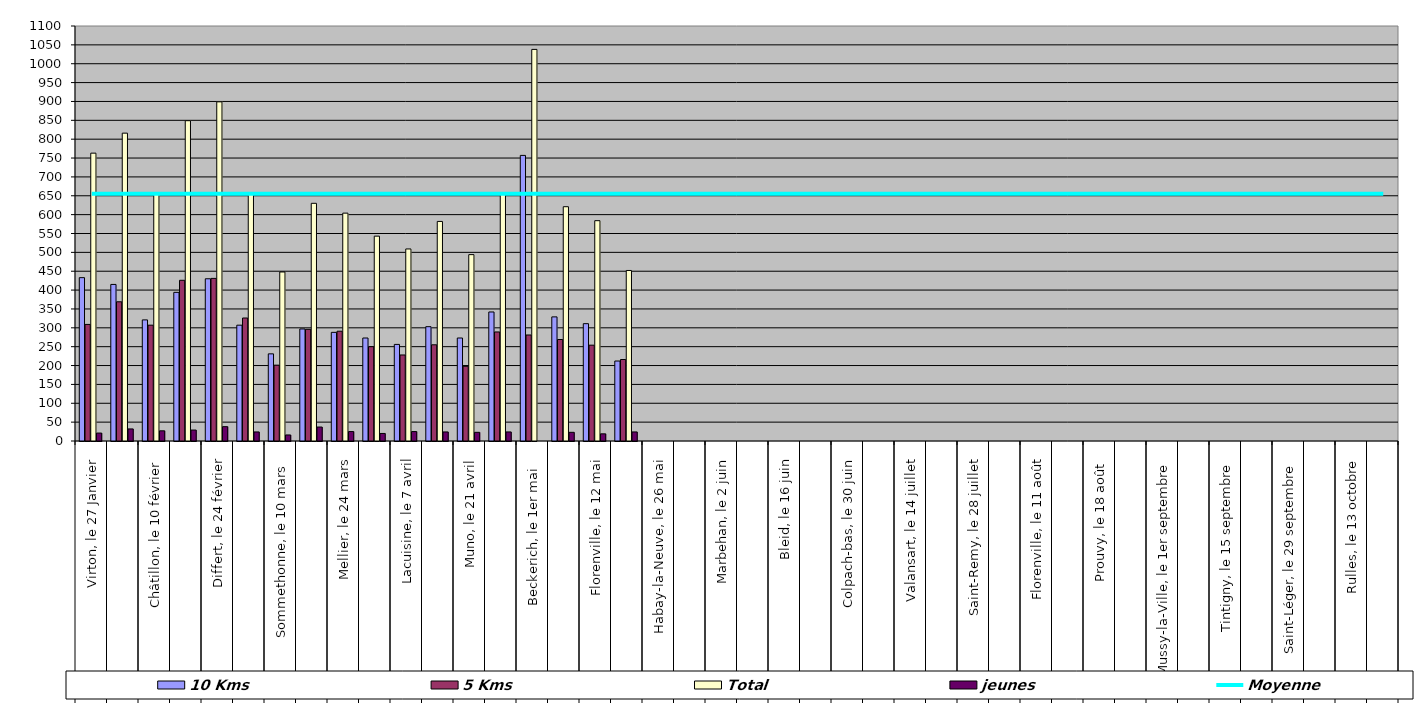
| Category | 10 Kms | 5 Kms | Total | jeunes |
|---|---|---|---|---|
| 0 | 433 | 309 | 763 | 21 |
| 1 | 415 | 369 | 816 | 32 |
| 2 | 321 | 307 | 655 | 27 |
| 3 | 394 | 426 | 849 | 29 |
| 4 | 430 | 431 | 899 | 38 |
| 5 | 307 | 326 | 657 | 24 |
| 6 | 231 | 201 | 448 | 16 |
| 7 | 297 | 296 | 630 | 37 |
| 8 | 288 | 291 | 604 | 25 |
| 9 | 273 | 250 | 543 | 20 |
| 10 | 256 | 228 | 509 | 25 |
| 11 | 303 | 255 | 582 | 24 |
| 12 | 273 | 198 | 494 | 23 |
| 13 | 342 | 289 | 655 | 24 |
| 14 | 757 | 281 | 1038 | 0 |
| 15 | 329 | 269 | 621 | 23 |
| 16 | 311 | 254 | 584 | 19 |
| 17 | 212 | 216 | 452 | 24 |
| 18 | 0 | 0 | 0 | 0 |
| 19 | 0 | 0 | 0 | 0 |
| 20 | 0 | 0 | 0 | 0 |
| 21 | 0 | 0 | 0 | 0 |
| 22 | 0 | 0 | 0 | 0 |
| 23 | 0 | 0 | 0 | 0 |
| 24 | 0 | 0 | 0 | 0 |
| 25 | 0 | 0 | 0 | 0 |
| 26 | 0 | 0 | 0 | 0 |
| 27 | 0 | 0 | 0 | 0 |
| 28 | 0 | 0 | 0 | 0 |
| 29 | 0 | 0 | 0 | 0 |
| 30 | 0 | 0 | 0 | 0 |
| 31 | 0 | 0 | 0 | 0 |
| 32 | 0 | 0 | 0 | 0 |
| 33 | 0 | 0 | 0 | 0 |
| 34 | 0 | 0 | 0 | 0 |
| 35 | 0 | 0 | 0 | 0 |
| 36 | 0 | 0 | 0 | 0 |
| 37 | 0 | 0 | 0 | 0 |
| 38 | 0 | 0 | 0 | 0 |
| 39 | 0 | 0 | 0 | 0 |
| 40 | 0 | 0 | 0 | 0 |
| 41 | 0 | 0 | 0 | 0 |